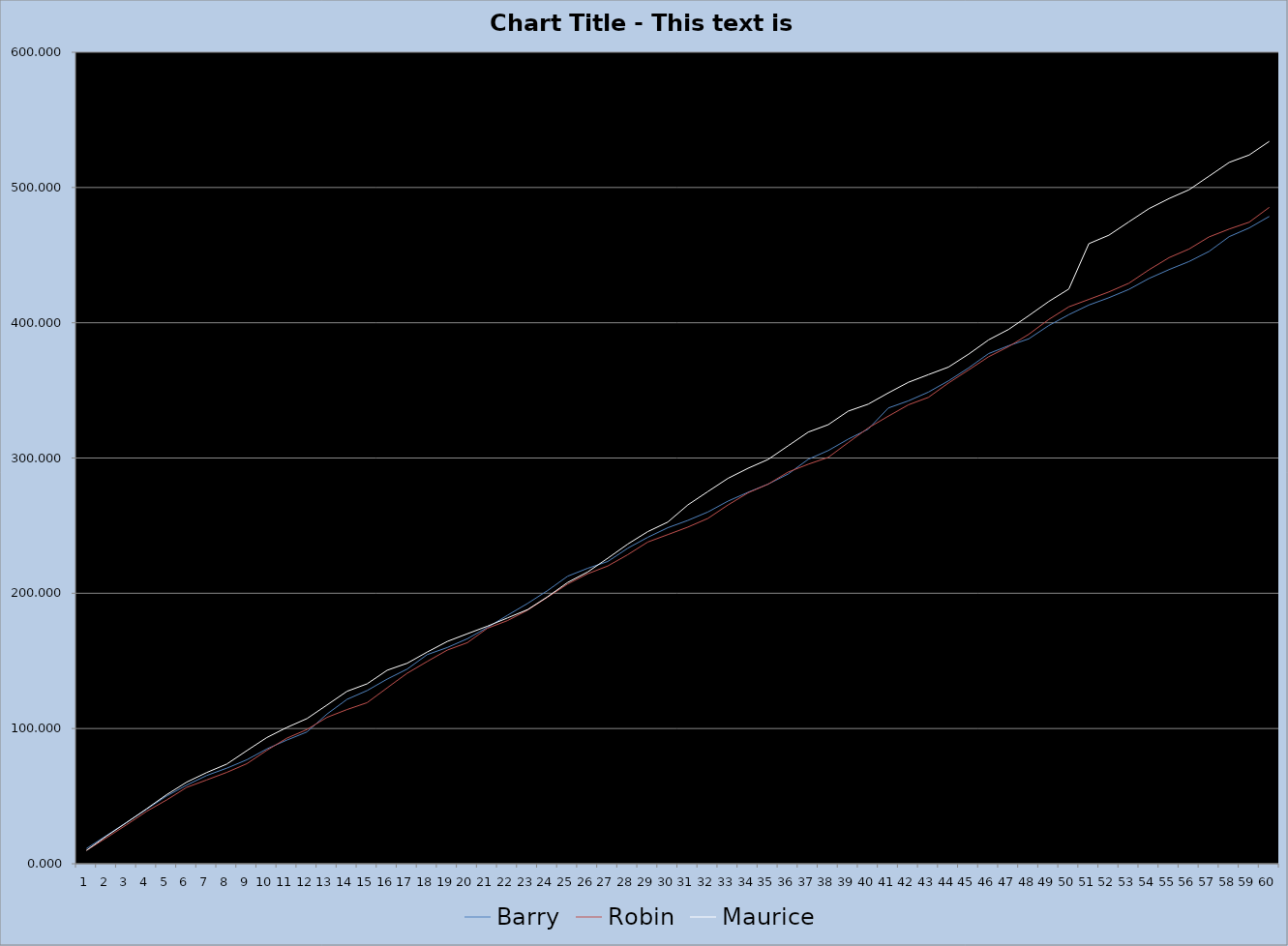
| Category | Barry | Robin | Maurice |
|---|---|---|---|
| 0 | 11.312 | 9.902 | 9.903 |
| 1 | 20.894 | 19.224 | 20.458 |
| 2 | 30.628 | 28.824 | 30.459 |
| 3 | 40.283 | 38.768 | 40.66 |
| 4 | 50.123 | 47.185 | 51.139 |
| 5 | 58.189 | 56.522 | 60.38 |
| 6 | 65.288 | 62.011 | 67.46 |
| 7 | 70.705 | 67.576 | 73.738 |
| 8 | 76.898 | 74.008 | 83.643 |
| 9 | 84.935 | 83.901 | 93.362 |
| 10 | 91.475 | 92.894 | 100.828 |
| 11 | 97.493 | 99.287 | 107.333 |
| 12 | 110.715 | 108.248 | 117.426 |
| 13 | 121.603 | 114.039 | 127.548 |
| 14 | 128.072 | 119.129 | 133.038 |
| 15 | 136.546 | 130.064 | 143.095 |
| 16 | 143.973 | 140.907 | 148.27 |
| 17 | 154.649 | 149.581 | 156.548 |
| 18 | 159.902 | 157.991 | 164.397 |
| 19 | 166.388 | 163.498 | 170.074 |
| 20 | 174.707 | 174.135 | 175.649 |
| 21 | 183.73 | 179.776 | 181.76 |
| 22 | 192.448 | 187.482 | 187.883 |
| 23 | 201.978 | 197.068 | 197.412 |
| 24 | 212.586 | 206.845 | 207.984 |
| 25 | 218.455 | 214.414 | 215.717 |
| 26 | 223.473 | 220.119 | 225.864 |
| 27 | 233.313 | 228.536 | 236.343 |
| 28 | 241.379 | 237.873 | 245.584 |
| 29 | 248.478 | 243.362 | 252.664 |
| 30 | 253.895 | 248.927 | 265.324 |
| 31 | 260.088 | 255.359 | 275.229 |
| 32 | 268.125 | 265.252 | 284.948 |
| 33 | 274.665 | 274.245 | 292.414 |
| 34 | 280.683 | 280.638 | 298.919 |
| 35 | 288.145 | 289.599 | 309.012 |
| 36 | 299.033 | 295.39 | 319.134 |
| 37 | 305.502 | 300.48 | 324.624 |
| 38 | 313.976 | 311.415 | 334.681 |
| 39 | 321.403 | 322.258 | 339.856 |
| 40 | 337.001 | 330.932 | 348.134 |
| 41 | 342.254 | 339.342 | 355.983 |
| 42 | 348.74 | 344.849 | 361.66 |
| 43 | 357.059 | 355.486 | 367.235 |
| 44 | 366.589 | 365.072 | 376.764 |
| 45 | 377.197 | 374.849 | 387.336 |
| 46 | 383.066 | 382.418 | 395.069 |
| 47 | 388.084 | 391.418 | 405.216 |
| 48 | 397.924 | 402.418 | 415.695 |
| 49 | 405.99 | 411.755 | 424.936 |
| 50 | 413.089 | 417.244 | 458.454 |
| 51 | 418.506 | 422.809 | 464.732 |
| 52 | 424.699 | 429.241 | 474.637 |
| 53 | 432.736 | 439.134 | 484.356 |
| 54 | 439.276 | 448.127 | 491.822 |
| 55 | 445.294 | 454.52 | 498.327 |
| 56 | 452.756 | 463.481 | 508.42 |
| 57 | 463.644 | 469.272 | 518.542 |
| 58 | 470.113 | 474.362 | 524.032 |
| 59 | 478.587 | 485.297 | 534.089 |